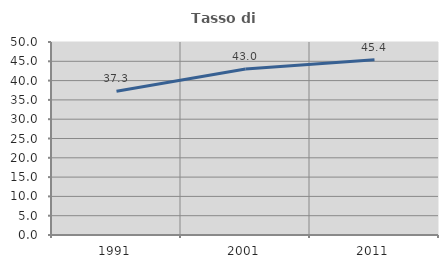
| Category | Tasso di occupazione   |
|---|---|
| 1991.0 | 37.267 |
| 2001.0 | 42.982 |
| 2011.0 | 45.424 |